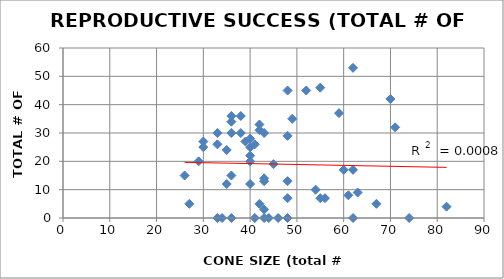
| Category | FEC |
|---|---|
| 60.0 | 17 |
| 62.0 | 17 |
| 38.0 | 36 |
| 56.0 | 7 |
| 42.0 | 33 |
| 48.0 | 45 |
| 46.0 | 0 |
| 59.0 | 37 |
| 74.0 | 0 |
| 48.0 | 13 |
| 82.0 | 4 |
| 49.0 | 35 |
| 45.0 | 19 |
| 36.0 | 36 |
| 52.0 | 45 |
| 62.0 | 53 |
| 43.0 | 30 |
| 43.0 | 13 |
| 29.0 | 20 |
| 39.0 | 27 |
| 26.0 | 15 |
| 35.0 | 24 |
| 34.0 | 0 |
| 43.0 | 0 |
| 36.0 | 0 |
| 41.0 | 0 |
| 40.0 | 25 |
| 55.0 | 46 |
| 42.0 | 31 |
| 33.0 | 26 |
| 63.0 | 9 |
| 36.0 | 30 |
| 61.0 | 8 |
| 43.0 | 14 |
| 67.0 | 5 |
| 48.0 | 0 |
| 70.0 | 42 |
| 55.0 | 7 |
| 62.0 | 0 |
| 41.0 | 26 |
| 48.0 | 7 |
| 44.0 | 0 |
| 33.0 | 0 |
| 40.0 | 12 |
| 30.0 | 25 |
| 40.0 | 22 |
| 40.0 | 20 |
| 54.0 | 10 |
| 42.0 | 5 |
| 33.0 | 30 |
| 71.0 | 32 |
| 36.0 | 34 |
| 38.0 | 30 |
| 35.0 | 12 |
| 40.0 | 28 |
| 43.0 | 3 |
| 36.0 | 15 |
| 48.0 | 29 |
| 30.0 | 27 |
| 27.0 | 5 |